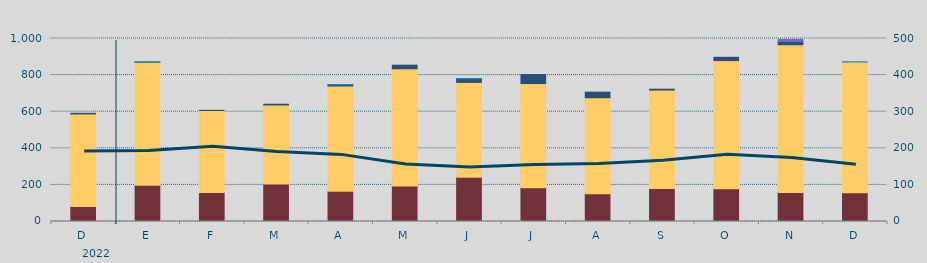
| Category | Carbón | Ciclo Combinado | Cogeneración | Consumo Bombeo | Eólica | Hidráulica | Otras Renovables | Solar fotovoltaica | Solar térmica | Turbinación bombeo | Nuclear |
|---|---|---|---|---|---|---|---|---|---|---|---|
| D | 82210 | 505508.6 | 0 | 3568.7 | 0 | 0 | 0 | 0 | 0 | 0 | 0 |
| E | 198667 | 672278.9 | 0 | 600 | 0 | 167.2 | 0 | 0 | 0 | 0 | 0 |
| F | 158446.8 | 448230.6 | 0 | 876 | 0 | 0 | 0 | 0 | 0 | 0 | 0 |
| M | 205470 | 431456.4 | 0 | 3844 | 0 | 0 | 0 | 0 | 0 | 0 | 0 |
| A | 165579 | 574881.6 | 0 | 7190 | 0 | 954 | 0 | 0 | 0 | 0 | 0 |
| M | 194640 | 639265.9 | 701 | 19503.3 | 0 | 0 | 0 | 0 | 0 | 0 | 0 |
| J | 241510 | 518484.5 | 0 | 20561.8 | 0 | 350.1 | 0 | 0 | 0 | 0 | 0 |
| J | 184698 | 569012.5 | 0 | 49075.9 | 0 | 0 | 0 | 0 | 0 | 0 | 0 |
| A | 151988 | 524255.8 | 0 | 30631.6 | 0 | 0 | 0 | 0 | 0 | 0 | 0 |
| S | 180894 | 537393.3 | 0 | 4681.3 | 0 | 0 | 0 | 0 | 0 | 0 | 0 |
| O | 179348.9 | 699577 | 400 | 17036.6 | 0 | 0 | 1381 | 0 | 0 | 0 | 0 |
| N | 158625 | 806211.9 | 1123.9 | 16397.2 | 0 | 180 | 12732 | 0 | 0 | 0 | 0 |
| D | 156652.5 | 714991.3 | 0 | 0 | 0 | 1170 | 0 | 0 | 0 | 0 | 0 |